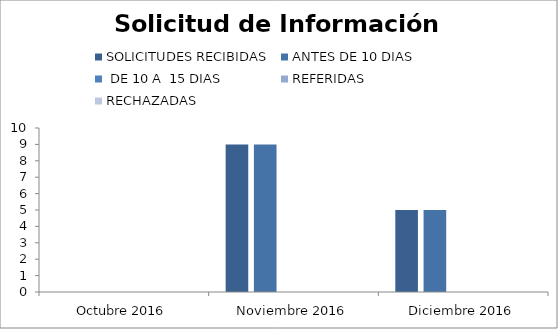
| Category | SOLICITUDES RECIBIDAS | ANTES DE 10 DIAS |  DE 10 A  15 DIAS  | REFERIDAS | RECHAZADAS |
|---|---|---|---|---|---|
| Octubre 2016 | 0 | 0 | 0 | 0 | 0 |
| Noviembre 2016 | 9 | 9 | 0 | 0 | 0 |
| Diciembre 2016 | 5 | 5 | 0 | 0 | 0 |